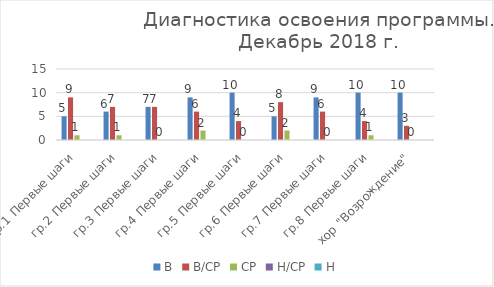
| Category | В | В/СР | СР | Н/СР | Н |
|---|---|---|---|---|---|
| гр.1 Первые шаги | 5 | 9 | 1 | 0 | 0 |
| гр.2 Первые шаги | 6 | 7 | 1 | 0 | 0 |
| гр.3 Первые шаги | 7 | 7 | 0 | 0 | 0 |
| гр.4 Первые шаги | 9 | 6 | 2 | 0 | 0 |
| гр.5 Первые шаги | 10 | 4 | 0 | 0 | 0 |
| гр.6 Первые шаги | 5 | 8 | 2 | 0 | 0 |
| гр.7 Первые шаги | 9 | 6 | 0 | 0 | 0 |
| гр.8 Первые шаги | 10 | 4 | 1 | 0 | 0 |
| хор "Возрождение" | 10 | 3 | 0 | 0 | 0 |